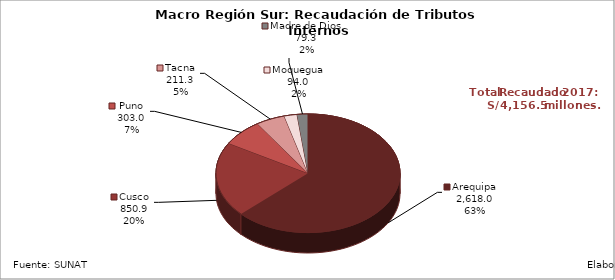
| Category | Series 0 |
|---|---|
| Arequipa | 2618.026 |
| Cusco | 850.935 |
| Puno | 303.003 |
| Tacna | 211.331 |
| Moquegua | 93.953 |
| Madre de Dios | 79.26 |